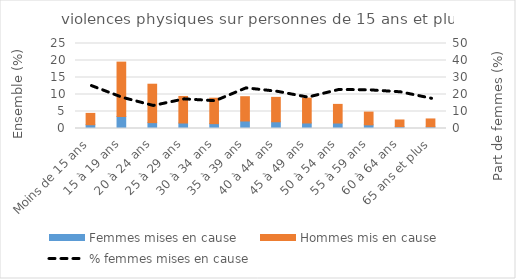
| Category | Femmes mises en cause | Hommes mis en cause |
|---|---|---|
| Moins de 15 ans | 1.109 | 3.334 |
| 15 à 19 ans | 3.52 | 16.002 |
| 20 à 24 ans | 1.726 | 11.297 |
| 25 à 29 ans | 1.616 | 7.811 |
| 30 à 34 ans | 1.43 | 7.481 |
| 35 à 39 ans | 2.209 | 7.142 |
| 40 à 44 ans | 1.98 | 7.176 |
| 45 à 49 ans | 1.625 | 7.312 |
| 50 à 54 ans | 1.608 | 5.484 |
| 55 à 59 ans | 1.083 | 3.74 |
| 60 à 64 ans | 0.533 | 1.972 |
| 65 ans et plus | 0.491 | 2.319 |